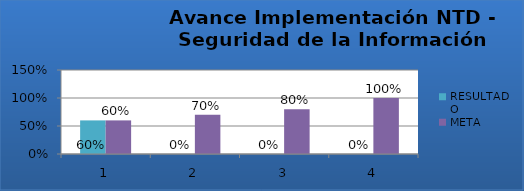
| Category | RESULTADO | META |
|---|---|---|
| 0 | 0.6 | 0.6 |
| 1 | 0 | 0.7 |
| 2 | 0 | 0.8 |
| 3 | 0 | 1 |